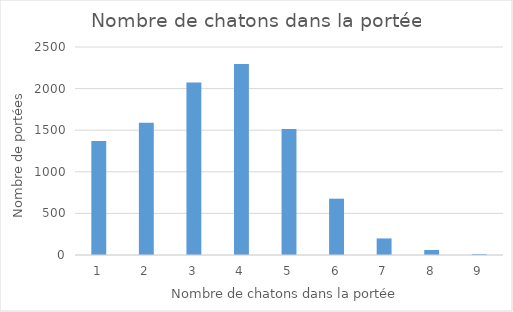
| Category | Series 0 |
|---|---|
| 1.0 | 1370 |
| 2.0 | 1589 |
| 3.0 | 2073 |
| 4.0 | 2296 |
| 5.0 | 1514 |
| 6.0 | 677 |
| 7.0 | 199 |
| 8.0 | 60 |
| 9.0 | 11 |